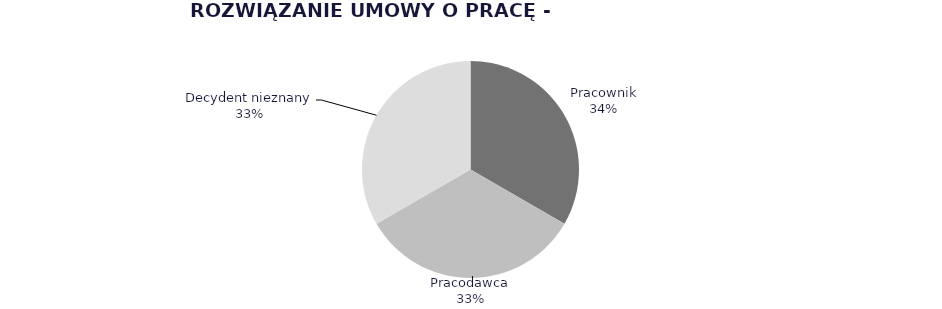
| Category | Series 0 |
|---|---|
| Pracownik | 0.3 |
| Pracodawca | 0.3 |
| Decydent nieznany | 0.3 |